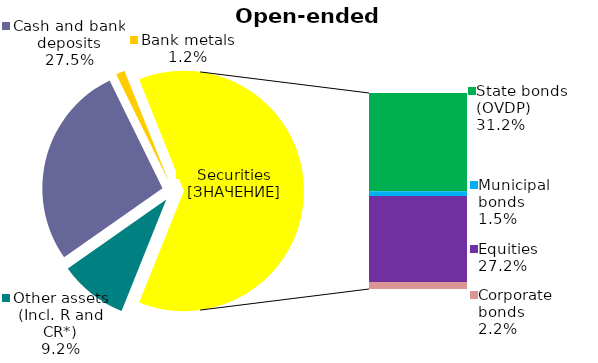
| Category | Series 0 |
|---|---|
| Other assets (Incl. R and CR*) | 0.092 |
| Cash and bank deposits | 0.275 |
| Bank metals | 0.012 |
| State bonds (OVDP) | 0.312 |
| Municipal bonds | 0.015 |
| Equities | 0.272 |
| Corporate bonds | 0.022 |